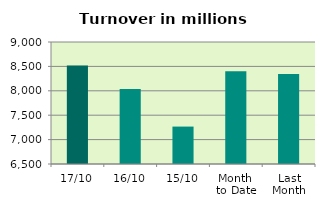
| Category | Series 0 |
|---|---|
| 17/10 | 8517.934 |
| 16/10 | 8034.802 |
| 15/10 | 7266.839 |
| Month 
to Date | 8403.023 |
| Last
Month | 8346.546 |